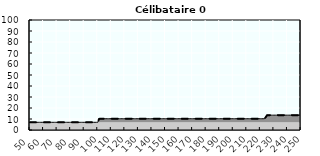
| Category | Coin fiscal marginal (somme des composantes) | Taux d’imposition marginal net |
|---|---|---|
| 50.0 | 7 | 7 |
| 51.0 | 7 | 7 |
| 52.0 | 7 | 7 |
| 53.0 | 7 | 7 |
| 54.0 | 7 | 7 |
| 55.0 | 7 | 7 |
| 56.0 | 7 | 7 |
| 57.0 | 7 | 7 |
| 58.0 | 7 | 7 |
| 59.0 | 7 | 7 |
| 60.0 | 7 | 7 |
| 61.0 | 7 | 7 |
| 62.0 | 7 | 7 |
| 63.0 | 7 | 7 |
| 64.0 | 7 | 7 |
| 65.0 | 7 | 7 |
| 66.0 | 7 | 7 |
| 67.0 | 7 | 7 |
| 68.0 | 7 | 7 |
| 69.0 | 7 | 7 |
| 70.0 | 7 | 7 |
| 71.0 | 7 | 7 |
| 72.0 | 7 | 7 |
| 73.0 | 7 | 7 |
| 74.0 | 7 | 7 |
| 75.0 | 7 | 7 |
| 76.0 | 7 | 7 |
| 77.0 | 7 | 7 |
| 78.0 | 7 | 7 |
| 79.0 | 7 | 7 |
| 80.0 | 7 | 7 |
| 81.0 | 7 | 7 |
| 82.0 | 7 | 7 |
| 83.0 | 7 | 7 |
| 84.0 | 7 | 7 |
| 85.0 | 7 | 7 |
| 86.0 | 7 | 7 |
| 87.0 | 7 | 7 |
| 88.0 | 7 | 7 |
| 89.0 | 7 | 7 |
| 90.0 | 7 | 7 |
| 91.0 | 7 | 7 |
| 92.0 | 7 | 7 |
| 93.0 | 7 | 7 |
| 94.0 | 7 | 7 |
| 95.0 | 7 | 7 |
| 96.0 | 7 | 7 |
| 97.0 | 7 | 7 |
| 98.0 | 7 | 7 |
| 99.0 | 7 | 7 |
| 100.0 | 7 | 7 |
| 101.0 | 10.082 | 10.082 |
| 102.0 | 10.25 | 10.25 |
| 103.0 | 10.25 | 10.25 |
| 104.0 | 10.25 | 10.25 |
| 105.0 | 10.25 | 10.25 |
| 106.0 | 10.25 | 10.25 |
| 107.0 | 10.25 | 10.25 |
| 108.0 | 10.25 | 10.25 |
| 109.0 | 10.25 | 10.25 |
| 110.0 | 10.25 | 10.25 |
| 111.0 | 10.25 | 10.25 |
| 112.0 | 10.25 | 10.25 |
| 113.0 | 10.25 | 10.25 |
| 114.0 | 10.25 | 10.25 |
| 115.0 | 10.25 | 10.25 |
| 116.0 | 10.25 | 10.25 |
| 117.0 | 10.25 | 10.25 |
| 118.0 | 10.25 | 10.25 |
| 119.0 | 10.25 | 10.25 |
| 120.0 | 10.25 | 10.25 |
| 121.0 | 10.25 | 10.25 |
| 122.0 | 10.25 | 10.25 |
| 123.0 | 10.25 | 10.25 |
| 124.0 | 10.25 | 10.25 |
| 125.0 | 10.25 | 10.25 |
| 126.0 | 10.25 | 10.25 |
| 127.0 | 10.25 | 10.25 |
| 128.0 | 10.25 | 10.25 |
| 129.0 | 10.25 | 10.25 |
| 130.0 | 10.25 | 10.25 |
| 131.0 | 10.25 | 10.25 |
| 132.0 | 10.25 | 10.25 |
| 133.0 | 10.25 | 10.25 |
| 134.0 | 10.25 | 10.25 |
| 135.0 | 10.25 | 10.25 |
| 136.0 | 10.25 | 10.25 |
| 137.0 | 10.25 | 10.25 |
| 138.0 | 10.25 | 10.25 |
| 139.0 | 10.25 | 10.25 |
| 140.0 | 10.25 | 10.25 |
| 141.0 | 10.25 | 10.25 |
| 142.0 | 10.25 | 10.25 |
| 143.0 | 10.25 | 10.25 |
| 144.0 | 10.25 | 10.25 |
| 145.0 | 10.25 | 10.25 |
| 146.0 | 10.25 | 10.25 |
| 147.0 | 10.25 | 10.25 |
| 148.0 | 10.25 | 10.25 |
| 149.0 | 10.25 | 10.25 |
| 150.0 | 10.25 | 10.25 |
| 151.0 | 10.25 | 10.25 |
| 152.0 | 10.25 | 10.25 |
| 153.0 | 10.25 | 10.25 |
| 154.0 | 10.25 | 10.25 |
| 155.0 | 10.25 | 10.25 |
| 156.0 | 10.25 | 10.25 |
| 157.0 | 10.25 | 10.25 |
| 158.0 | 10.25 | 10.25 |
| 159.0 | 10.25 | 10.25 |
| 160.0 | 10.25 | 10.25 |
| 161.0 | 10.25 | 10.25 |
| 162.0 | 10.25 | 10.25 |
| 163.0 | 10.25 | 10.25 |
| 164.0 | 10.25 | 10.25 |
| 165.0 | 10.25 | 10.25 |
| 166.0 | 10.25 | 10.25 |
| 167.0 | 10.25 | 10.25 |
| 168.0 | 10.25 | 10.25 |
| 169.0 | 10.25 | 10.25 |
| 170.0 | 10.25 | 10.25 |
| 171.0 | 10.25 | 10.25 |
| 172.0 | 10.25 | 10.25 |
| 173.0 | 10.25 | 10.25 |
| 174.0 | 10.25 | 10.25 |
| 175.0 | 10.25 | 10.25 |
| 176.0 | 10.25 | 10.25 |
| 177.0 | 10.25 | 10.25 |
| 178.0 | 10.25 | 10.25 |
| 179.0 | 10.25 | 10.25 |
| 180.0 | 10.25 | 10.25 |
| 181.0 | 10.25 | 10.25 |
| 182.0 | 10.25 | 10.25 |
| 183.0 | 10.25 | 10.25 |
| 184.0 | 10.25 | 10.25 |
| 185.0 | 10.25 | 10.25 |
| 186.0 | 10.25 | 10.25 |
| 187.0 | 10.25 | 10.25 |
| 188.0 | 10.25 | 10.25 |
| 189.0 | 10.25 | 10.25 |
| 190.0 | 10.25 | 10.25 |
| 191.0 | 10.25 | 10.25 |
| 192.0 | 10.25 | 10.25 |
| 193.0 | 10.25 | 10.25 |
| 194.0 | 10.25 | 10.25 |
| 195.0 | 10.25 | 10.25 |
| 196.0 | 10.25 | 10.25 |
| 197.0 | 10.25 | 10.25 |
| 198.0 | 10.25 | 10.25 |
| 199.0 | 10.25 | 10.25 |
| 200.0 | 10.25 | 10.25 |
| 201.0 | 10.25 | 10.25 |
| 202.0 | 10.25 | 10.25 |
| 203.0 | 10.25 | 10.25 |
| 204.0 | 10.25 | 10.25 |
| 205.0 | 10.25 | 10.25 |
| 206.0 | 10.25 | 10.25 |
| 207.0 | 10.25 | 10.25 |
| 208.0 | 10.25 | 10.25 |
| 209.0 | 10.25 | 10.25 |
| 210.0 | 10.25 | 10.25 |
| 211.0 | 10.25 | 10.25 |
| 212.0 | 10.25 | 10.25 |
| 213.0 | 10.25 | 10.25 |
| 214.0 | 10.25 | 10.25 |
| 215.0 | 10.25 | 10.25 |
| 216.0 | 10.25 | 10.25 |
| 217.0 | 10.25 | 10.25 |
| 218.0 | 10.25 | 10.25 |
| 219.0 | 10.25 | 10.25 |
| 220.0 | 10.25 | 10.25 |
| 221.0 | 10.25 | 10.25 |
| 222.0 | 10.25 | 10.25 |
| 223.0 | 10.25 | 10.25 |
| 224.0 | 11.683 | 11.683 |
| 225.0 | 13.5 | 13.5 |
| 226.0 | 13.5 | 13.5 |
| 227.0 | 13.5 | 13.5 |
| 228.0 | 13.5 | 13.5 |
| 229.0 | 13.5 | 13.5 |
| 230.0 | 13.5 | 13.5 |
| 231.0 | 13.5 | 13.5 |
| 232.0 | 13.5 | 13.5 |
| 233.0 | 13.5 | 13.5 |
| 234.0 | 13.5 | 13.5 |
| 235.0 | 13.5 | 13.5 |
| 236.0 | 13.5 | 13.5 |
| 237.0 | 13.5 | 13.5 |
| 238.0 | 13.5 | 13.5 |
| 239.0 | 13.5 | 13.5 |
| 240.0 | 13.5 | 13.5 |
| 241.0 | 13.5 | 13.5 |
| 242.0 | 13.5 | 13.5 |
| 243.0 | 13.5 | 13.5 |
| 244.0 | 13.5 | 13.5 |
| 245.0 | 13.5 | 13.5 |
| 246.0 | 13.5 | 13.5 |
| 247.0 | 13.5 | 13.5 |
| 248.0 | 13.5 | 13.5 |
| 249.0 | 13.5 | 13.5 |
| 250.0 | 13.5 | 13.5 |